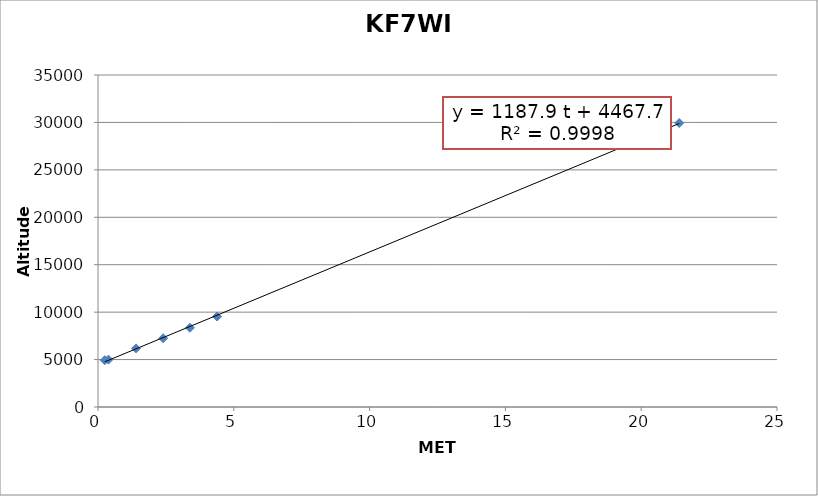
| Category | KF7WII |
|---|---|
| 0.25 | 4934 |
| 0.38333333333333336 | 4996 |
| 1.4 | 6181 |
| 2.4 | 7247 |
| 3.3833333333333333 | 8353 |
| 4.383333333333334 | 9537 |
| 21.4 | 29940 |